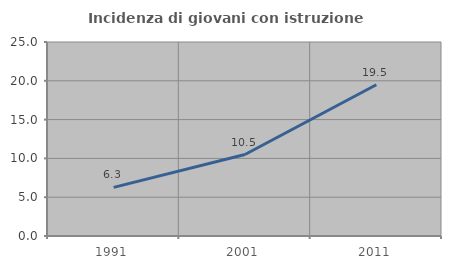
| Category | Incidenza di giovani con istruzione universitaria |
|---|---|
| 1991.0 | 6.269 |
| 2001.0 | 10.502 |
| 2011.0 | 19.493 |